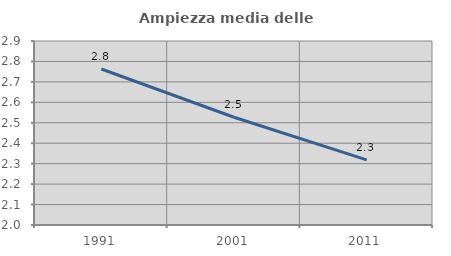
| Category | Ampiezza media delle famiglie |
|---|---|
| 1991.0 | 2.763 |
| 2001.0 | 2.527 |
| 2011.0 | 2.319 |